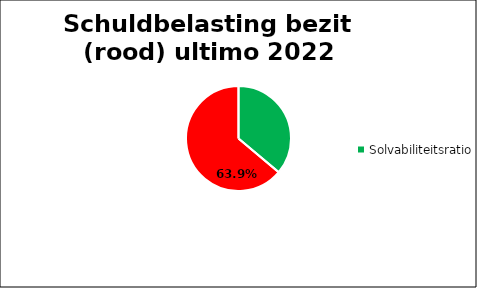
| Category | solvabiliteitsratio |
|---|---|
| Solvabiliteitsratio ultimo 2022 | 0.361 |